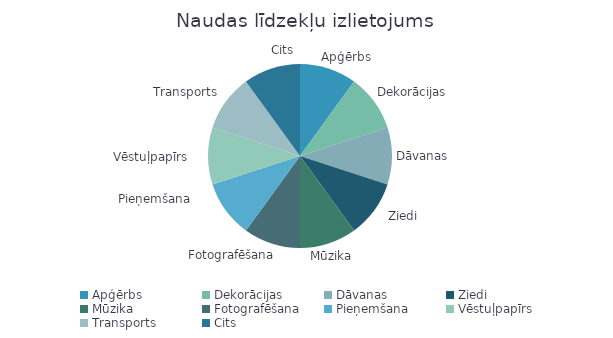
| Category | Summa |
|---|---|
| Apģērbs | 1 |
| Dekorācijas | 1 |
| Dāvanas | 1 |
| Ziedi | 1 |
| Mūzika | 1 |
| Fotografēšana | 1 |
| Pieņemšana | 1 |
| Vēstuļpapīrs | 1 |
| Transports | 1 |
| Cits | 1 |